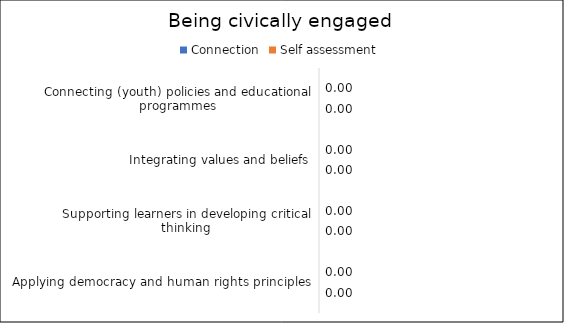
| Category | Connection | Self assessment |
|---|---|---|
| Connecting (youth) policies and educational programmes | 0 | 0 |
| Integrating values and beliefs | 0 | 0 |
| Supporting learners in developing critical thinking | 0 | 0 |
| Applying democracy and human rights principles | 0 | 0 |